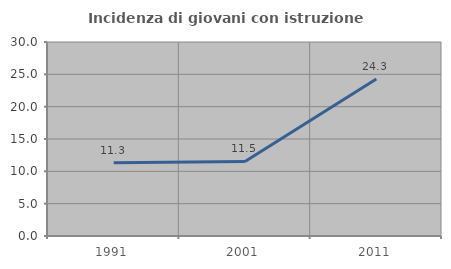
| Category | Incidenza di giovani con istruzione universitaria |
|---|---|
| 1991.0 | 11.33 |
| 2001.0 | 11.524 |
| 2011.0 | 24.272 |